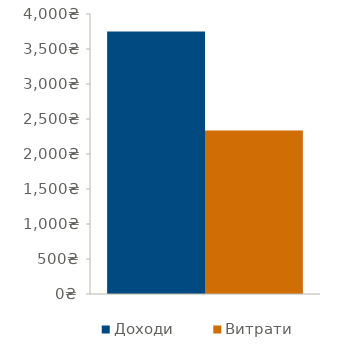
| Category | Доходи | Витрати |
|---|---|---|
| 0 | 3750 | 2336 |